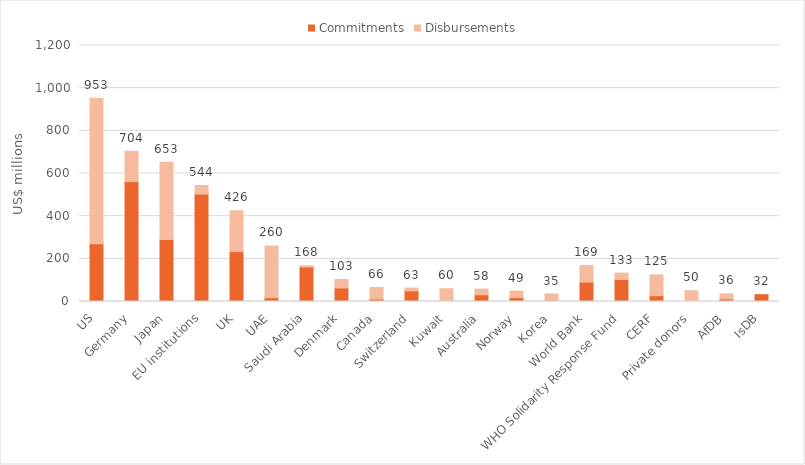
| Category | Commitments | Disbursements |
|---|---|---|
| US | 270.516 | 682.702 |
| Germany | 561.76 | 142.542 |
| Japan | 290.21 | 362.586 |
| EU institutions | 503.223 | 40.664 |
| UK | 233.607 | 192.076 |
| UAE | 17.5 | 242.938 |
| Saudi Arabia | 161.553 | 6.048 |
| Denmark | 63.51 | 39.614 |
| Canada | 11.37 | 54.341 |
| Switzerland | 49.796 | 13.016 |
| Kuwait | 0 | 60 |
| Australia | 31.417 | 26.472 |
| Norway | 18.054 | 30.746 |
| Korea | 5.299 | 29.767 |
| World Bank | 90.729 | 77.841 |
| WHO Solidarity Response Fund | 103.158 | 30 |
| CERF | 27.263 | 97.335 |
| Private donors | 3.456 | 47.002 |
| AfDB | 12.082 | 23.569 |
| IsDB | 31.832 | 0 |